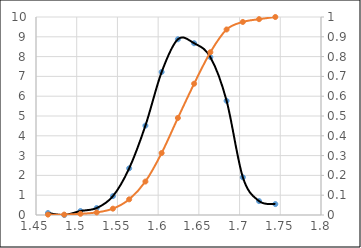
| Category | Series 0 |
|---|---|
| 1.4647087819672169 | 0.1 |
| 1.484650742158084 | 0 |
| 1.5045927023489507 | 0.201 |
| 1.5245346625398177 | 0.351 |
| 1.5444766227306848 | 0.953 |
| 1.5644185829215518 | 2.357 |
| 1.5843605431124186 | 4.513 |
| 1.6043025033032856 | 7.221 |
| 1.6242444634941526 | 8.876 |
| 1.6441864236850194 | 8.675 |
| 1.6641283838758865 | 7.973 |
| 1.6840703440667535 | 5.767 |
| 1.7040123042576205 | 1.906 |
| 1.7239542644484875 | 0.702 |
| 1.7438962246393543 | 0.552 |